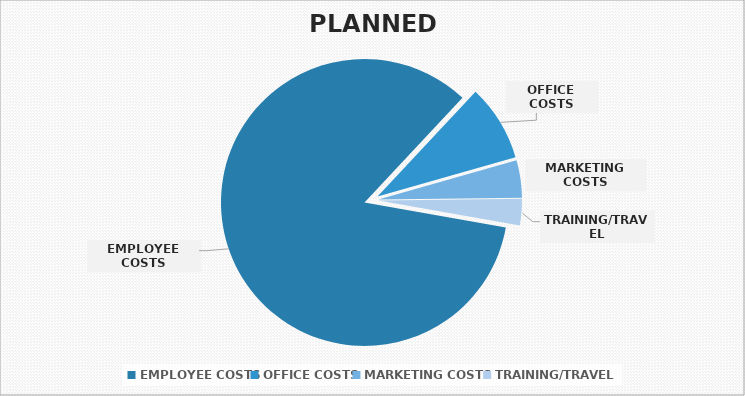
| Category | Series 0 |
|---|---|
| EMPLOYEE COSTS | 1355090 |
| OFFICE COSTS | 138740 |
| MARKETING COSTS | 67800 |
| TRAINING/TRAVEL | 48000 |